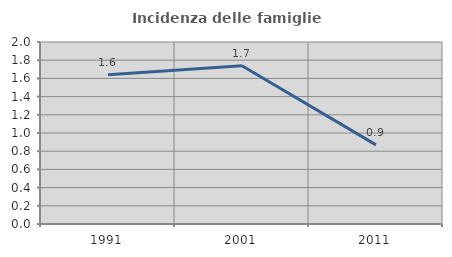
| Category | Incidenza delle famiglie numerose |
|---|---|
| 1991.0 | 1.639 |
| 2001.0 | 1.739 |
| 2011.0 | 0.87 |